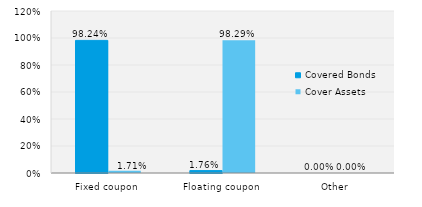
| Category | Covered Bonds | Cover Assets |
|---|---|---|
| Fixed coupon | 0.982 | 0.017 |
| Floating coupon | 0.018 | 0.983 |
| Other | 0 | 0 |